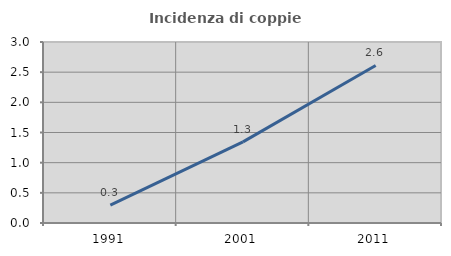
| Category | Incidenza di coppie miste |
|---|---|
| 1991.0 | 0.298 |
| 2001.0 | 1.344 |
| 2011.0 | 2.611 |